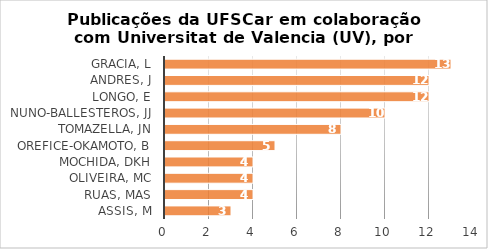
| Category | # Records |
|---|---|
| GRACIA, L | 13 |
| ANDRES, J | 12 |
| LONGO, E | 12 |
| NUNO-BALLESTEROS, JJ | 10 |
| TOMAZELLA, JN | 8 |
| OREFICE-OKAMOTO, B | 5 |
| MOCHIDA, DKH | 4 |
| OLIVEIRA, MC | 4 |
| RUAS, MAS | 4 |
| ASSIS, M | 3 |